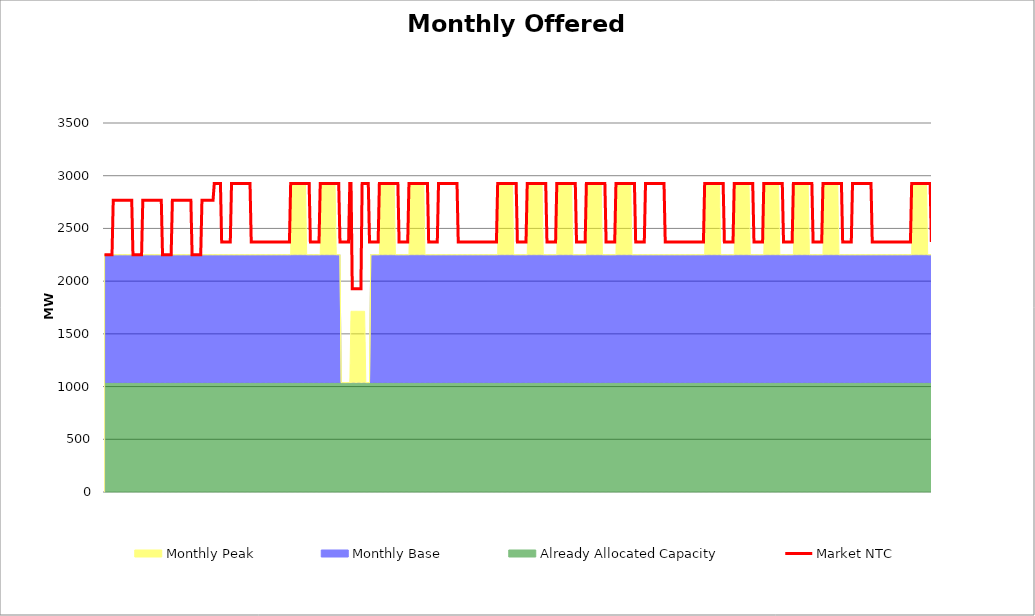
| Category | Market NTC |
|---|---|
| 0 | 2251 |
| 1 | 2251 |
| 2 | 2251 |
| 3 | 2251 |
| 4 | 2251 |
| 5 | 2251 |
| 6 | 2251 |
| 7 | 2767 |
| 8 | 2767 |
| 9 | 2767 |
| 10 | 2767 |
| 11 | 2767 |
| 12 | 2767 |
| 13 | 2767 |
| 14 | 2767 |
| 15 | 2767 |
| 16 | 2767 |
| 17 | 2767 |
| 18 | 2767 |
| 19 | 2767 |
| 20 | 2767 |
| 21 | 2767 |
| 22 | 2767 |
| 23 | 2251 |
| 24 | 2251 |
| 25 | 2251 |
| 26 | 2251 |
| 27 | 2251 |
| 28 | 2251 |
| 29 | 2251 |
| 30 | 2251 |
| 31 | 2767 |
| 32 | 2767 |
| 33 | 2767 |
| 34 | 2767 |
| 35 | 2767 |
| 36 | 2767 |
| 37 | 2767 |
| 38 | 2767 |
| 39 | 2767 |
| 40 | 2767 |
| 41 | 2767 |
| 42 | 2767 |
| 43 | 2767 |
| 44 | 2767 |
| 45 | 2767 |
| 46 | 2767 |
| 47 | 2251 |
| 48 | 2251 |
| 49 | 2251 |
| 50 | 2251 |
| 51 | 2251 |
| 52 | 2251 |
| 53 | 2251 |
| 54 | 2251 |
| 55 | 2767 |
| 56 | 2767 |
| 57 | 2767 |
| 58 | 2767 |
| 59 | 2767 |
| 60 | 2767 |
| 61 | 2767 |
| 62 | 2767 |
| 63 | 2767 |
| 64 | 2767 |
| 65 | 2767 |
| 66 | 2767 |
| 67 | 2767 |
| 68 | 2767 |
| 69 | 2767 |
| 70 | 2767 |
| 71 | 2251 |
| 72 | 2251 |
| 73 | 2251 |
| 74 | 2251 |
| 75 | 2251 |
| 76 | 2251 |
| 77 | 2251 |
| 78 | 2251 |
| 79 | 2767 |
| 80 | 2767 |
| 81 | 2767 |
| 82 | 2767 |
| 83 | 2767 |
| 84 | 2767 |
| 85 | 2767 |
| 86 | 2767 |
| 87 | 2767 |
| 88 | 2767 |
| 89 | 2927 |
| 90 | 2927 |
| 91 | 2927 |
| 92 | 2927 |
| 93 | 2927 |
| 94 | 2927 |
| 95 | 2371 |
| 96 | 2371 |
| 97 | 2371 |
| 98 | 2371 |
| 99 | 2371 |
| 100 | 2371 |
| 101 | 2371 |
| 102 | 2371 |
| 103 | 2927 |
| 104 | 2927 |
| 105 | 2927 |
| 106 | 2927 |
| 107 | 2927 |
| 108 | 2927 |
| 109 | 2927 |
| 110 | 2927 |
| 111 | 2927 |
| 112 | 2927 |
| 113 | 2927 |
| 114 | 2927 |
| 115 | 2927 |
| 116 | 2927 |
| 117 | 2927 |
| 118 | 2927 |
| 119 | 2371 |
| 120 | 2371 |
| 121 | 2371 |
| 122 | 2371 |
| 123 | 2371 |
| 124 | 2371 |
| 125 | 2371 |
| 126 | 2371 |
| 127 | 2371 |
| 128 | 2371 |
| 129 | 2371 |
| 130 | 2371 |
| 131 | 2371 |
| 132 | 2371 |
| 133 | 2371 |
| 134 | 2371 |
| 135 | 2371 |
| 136 | 2371 |
| 137 | 2371 |
| 138 | 2371 |
| 139 | 2371 |
| 140 | 2371 |
| 141 | 2371 |
| 142 | 2371 |
| 143 | 2371 |
| 144 | 2371 |
| 145 | 2371 |
| 146 | 2371 |
| 147 | 2371 |
| 148 | 2371 |
| 149 | 2371 |
| 150 | 2371 |
| 151 | 2927 |
| 152 | 2927 |
| 153 | 2927 |
| 154 | 2927 |
| 155 | 2927 |
| 156 | 2927 |
| 157 | 2927 |
| 158 | 2927 |
| 159 | 2927 |
| 160 | 2927 |
| 161 | 2927 |
| 162 | 2927 |
| 163 | 2927 |
| 164 | 2927 |
| 165 | 2927 |
| 166 | 2927 |
| 167 | 2371 |
| 168 | 2371 |
| 169 | 2371 |
| 170 | 2371 |
| 171 | 2371 |
| 172 | 2371 |
| 173 | 2371 |
| 174 | 2371 |
| 175 | 2927 |
| 176 | 2927 |
| 177 | 2927 |
| 178 | 2927 |
| 179 | 2927 |
| 180 | 2927 |
| 181 | 2927 |
| 182 | 2927 |
| 183 | 2927 |
| 184 | 2927 |
| 185 | 2927 |
| 186 | 2927 |
| 187 | 2927 |
| 188 | 2927 |
| 189 | 2927 |
| 190 | 2927 |
| 191 | 2371 |
| 192 | 2371 |
| 193 | 2371 |
| 194 | 2371 |
| 195 | 2371 |
| 196 | 2371 |
| 197 | 2371 |
| 198 | 2371 |
| 199 | 2927 |
| 200 | 2927 |
| 201 | 1927 |
| 202 | 1927 |
| 203 | 1927 |
| 204 | 1927 |
| 205 | 1927 |
| 206 | 1927 |
| 207 | 1927 |
| 208 | 1927 |
| 209 | 2927 |
| 210 | 2927 |
| 211 | 2927 |
| 212 | 2927 |
| 213 | 2927 |
| 214 | 2927 |
| 215 | 2371 |
| 216 | 2371 |
| 217 | 2371 |
| 218 | 2371 |
| 219 | 2371 |
| 220 | 2371 |
| 221 | 2371 |
| 222 | 2371 |
| 223 | 2927 |
| 224 | 2927 |
| 225 | 2927 |
| 226 | 2927 |
| 227 | 2927 |
| 228 | 2927 |
| 229 | 2927 |
| 230 | 2927 |
| 231 | 2927 |
| 232 | 2927 |
| 233 | 2927 |
| 234 | 2927 |
| 235 | 2927 |
| 236 | 2927 |
| 237 | 2927 |
| 238 | 2927 |
| 239 | 2371 |
| 240 | 2371 |
| 241 | 2371 |
| 242 | 2371 |
| 243 | 2371 |
| 244 | 2371 |
| 245 | 2371 |
| 246 | 2371 |
| 247 | 2927 |
| 248 | 2927 |
| 249 | 2927 |
| 250 | 2927 |
| 251 | 2927 |
| 252 | 2927 |
| 253 | 2927 |
| 254 | 2927 |
| 255 | 2927 |
| 256 | 2927 |
| 257 | 2927 |
| 258 | 2927 |
| 259 | 2927 |
| 260 | 2927 |
| 261 | 2927 |
| 262 | 2927 |
| 263 | 2371 |
| 264 | 2371 |
| 265 | 2371 |
| 266 | 2371 |
| 267 | 2371 |
| 268 | 2371 |
| 269 | 2371 |
| 270 | 2371 |
| 271 | 2927 |
| 272 | 2927 |
| 273 | 2927 |
| 274 | 2927 |
| 275 | 2927 |
| 276 | 2927 |
| 277 | 2927 |
| 278 | 2927 |
| 279 | 2927 |
| 280 | 2927 |
| 281 | 2927 |
| 282 | 2927 |
| 283 | 2927 |
| 284 | 2927 |
| 285 | 2927 |
| 286 | 2927 |
| 287 | 2371 |
| 288 | 2371 |
| 289 | 2371 |
| 290 | 2371 |
| 291 | 2371 |
| 292 | 2371 |
| 293 | 2371 |
| 294 | 2371 |
| 295 | 2371 |
| 296 | 2371 |
| 297 | 2371 |
| 298 | 2371 |
| 299 | 2371 |
| 300 | 2371 |
| 301 | 2371 |
| 302 | 2371 |
| 303 | 2371 |
| 304 | 2371 |
| 305 | 2371 |
| 306 | 2371 |
| 307 | 2371 |
| 308 | 2371 |
| 309 | 2371 |
| 310 | 2371 |
| 311 | 2371 |
| 312 | 2371 |
| 313 | 2371 |
| 314 | 2371 |
| 315 | 2371 |
| 316 | 2371 |
| 317 | 2371 |
| 318 | 2371 |
| 319 | 2927 |
| 320 | 2927 |
| 321 | 2927 |
| 322 | 2927 |
| 323 | 2927 |
| 324 | 2927 |
| 325 | 2927 |
| 326 | 2927 |
| 327 | 2927 |
| 328 | 2927 |
| 329 | 2927 |
| 330 | 2927 |
| 331 | 2927 |
| 332 | 2927 |
| 333 | 2927 |
| 334 | 2927 |
| 335 | 2371 |
| 336 | 2371 |
| 337 | 2371 |
| 338 | 2371 |
| 339 | 2371 |
| 340 | 2371 |
| 341 | 2371 |
| 342 | 2371 |
| 343 | 2927 |
| 344 | 2927 |
| 345 | 2927 |
| 346 | 2927 |
| 347 | 2927 |
| 348 | 2927 |
| 349 | 2927 |
| 350 | 2927 |
| 351 | 2927 |
| 352 | 2927 |
| 353 | 2927 |
| 354 | 2927 |
| 355 | 2927 |
| 356 | 2927 |
| 357 | 2927 |
| 358 | 2927 |
| 359 | 2371 |
| 360 | 2371 |
| 361 | 2371 |
| 362 | 2371 |
| 363 | 2371 |
| 364 | 2371 |
| 365 | 2371 |
| 366 | 2371 |
| 367 | 2927 |
| 368 | 2927 |
| 369 | 2927 |
| 370 | 2927 |
| 371 | 2927 |
| 372 | 2927 |
| 373 | 2927 |
| 374 | 2927 |
| 375 | 2927 |
| 376 | 2927 |
| 377 | 2927 |
| 378 | 2927 |
| 379 | 2927 |
| 380 | 2927 |
| 381 | 2927 |
| 382 | 2927 |
| 383 | 2371 |
| 384 | 2371 |
| 385 | 2371 |
| 386 | 2371 |
| 387 | 2371 |
| 388 | 2371 |
| 389 | 2371 |
| 390 | 2371 |
| 391 | 2927 |
| 392 | 2927 |
| 393 | 2927 |
| 394 | 2927 |
| 395 | 2927 |
| 396 | 2927 |
| 397 | 2927 |
| 398 | 2927 |
| 399 | 2927 |
| 400 | 2927 |
| 401 | 2927 |
| 402 | 2927 |
| 403 | 2927 |
| 404 | 2927 |
| 405 | 2927 |
| 406 | 2927 |
| 407 | 2371 |
| 408 | 2371 |
| 409 | 2371 |
| 410 | 2371 |
| 411 | 2371 |
| 412 | 2371 |
| 413 | 2371 |
| 414 | 2371 |
| 415 | 2927 |
| 416 | 2927 |
| 417 | 2927 |
| 418 | 2927 |
| 419 | 2927 |
| 420 | 2927 |
| 421 | 2927 |
| 422 | 2927 |
| 423 | 2927 |
| 424 | 2927 |
| 425 | 2927 |
| 426 | 2927 |
| 427 | 2927 |
| 428 | 2927 |
| 429 | 2927 |
| 430 | 2927 |
| 431 | 2371 |
| 432 | 2371 |
| 433 | 2371 |
| 434 | 2371 |
| 435 | 2371 |
| 436 | 2371 |
| 437 | 2371 |
| 438 | 2371 |
| 439 | 2927 |
| 440 | 2927 |
| 441 | 2927 |
| 442 | 2927 |
| 443 | 2927 |
| 444 | 2927 |
| 445 | 2927 |
| 446 | 2927 |
| 447 | 2927 |
| 448 | 2927 |
| 449 | 2927 |
| 450 | 2927 |
| 451 | 2927 |
| 452 | 2927 |
| 453 | 2927 |
| 454 | 2927 |
| 455 | 2371 |
| 456 | 2371 |
| 457 | 2371 |
| 458 | 2371 |
| 459 | 2371 |
| 460 | 2371 |
| 461 | 2371 |
| 462 | 2371 |
| 463 | 2371 |
| 464 | 2371 |
| 465 | 2371 |
| 466 | 2371 |
| 467 | 2371 |
| 468 | 2371 |
| 469 | 2371 |
| 470 | 2371 |
| 471 | 2371 |
| 472 | 2371 |
| 473 | 2371 |
| 474 | 2371 |
| 475 | 2371 |
| 476 | 2371 |
| 477 | 2371 |
| 478 | 2371 |
| 479 | 2371 |
| 480 | 2371 |
| 481 | 2371 |
| 482 | 2371 |
| 483 | 2371 |
| 484 | 2371 |
| 485 | 2371 |
| 486 | 2371 |
| 487 | 2927 |
| 488 | 2927 |
| 489 | 2927 |
| 490 | 2927 |
| 491 | 2927 |
| 492 | 2927 |
| 493 | 2927 |
| 494 | 2927 |
| 495 | 2927 |
| 496 | 2927 |
| 497 | 2927 |
| 498 | 2927 |
| 499 | 2927 |
| 500 | 2927 |
| 501 | 2927 |
| 502 | 2927 |
| 503 | 2371 |
| 504 | 2371 |
| 505 | 2371 |
| 506 | 2371 |
| 507 | 2371 |
| 508 | 2371 |
| 509 | 2371 |
| 510 | 2371 |
| 511 | 2927 |
| 512 | 2927 |
| 513 | 2927 |
| 514 | 2927 |
| 515 | 2927 |
| 516 | 2927 |
| 517 | 2927 |
| 518 | 2927 |
| 519 | 2927 |
| 520 | 2927 |
| 521 | 2927 |
| 522 | 2927 |
| 523 | 2927 |
| 524 | 2927 |
| 525 | 2927 |
| 526 | 2927 |
| 527 | 2371 |
| 528 | 2371 |
| 529 | 2371 |
| 530 | 2371 |
| 531 | 2371 |
| 532 | 2371 |
| 533 | 2371 |
| 534 | 2371 |
| 535 | 2927 |
| 536 | 2927 |
| 537 | 2927 |
| 538 | 2927 |
| 539 | 2927 |
| 540 | 2927 |
| 541 | 2927 |
| 542 | 2927 |
| 543 | 2927 |
| 544 | 2927 |
| 545 | 2927 |
| 546 | 2927 |
| 547 | 2927 |
| 548 | 2927 |
| 549 | 2927 |
| 550 | 2927 |
| 551 | 2371 |
| 552 | 2371 |
| 553 | 2371 |
| 554 | 2371 |
| 555 | 2371 |
| 556 | 2371 |
| 557 | 2371 |
| 558 | 2371 |
| 559 | 2927 |
| 560 | 2927 |
| 561 | 2927 |
| 562 | 2927 |
| 563 | 2927 |
| 564 | 2927 |
| 565 | 2927 |
| 566 | 2927 |
| 567 | 2927 |
| 568 | 2927 |
| 569 | 2927 |
| 570 | 2927 |
| 571 | 2927 |
| 572 | 2927 |
| 573 | 2927 |
| 574 | 2927 |
| 575 | 2371 |
| 576 | 2371 |
| 577 | 2371 |
| 578 | 2371 |
| 579 | 2371 |
| 580 | 2371 |
| 581 | 2371 |
| 582 | 2371 |
| 583 | 2927 |
| 584 | 2927 |
| 585 | 2927 |
| 586 | 2927 |
| 587 | 2927 |
| 588 | 2927 |
| 589 | 2927 |
| 590 | 2927 |
| 591 | 2927 |
| 592 | 2927 |
| 593 | 2927 |
| 594 | 2927 |
| 595 | 2927 |
| 596 | 2927 |
| 597 | 2927 |
| 598 | 2927 |
| 599 | 2371 |
| 600 | 2371 |
| 601 | 2371 |
| 602 | 2371 |
| 603 | 2371 |
| 604 | 2371 |
| 605 | 2371 |
| 606 | 2371 |
| 607 | 2927 |
| 608 | 2927 |
| 609 | 2927 |
| 610 | 2927 |
| 611 | 2927 |
| 612 | 2927 |
| 613 | 2927 |
| 614 | 2927 |
| 615 | 2927 |
| 616 | 2927 |
| 617 | 2927 |
| 618 | 2927 |
| 619 | 2927 |
| 620 | 2927 |
| 621 | 2927 |
| 622 | 2927 |
| 623 | 2371 |
| 624 | 2371 |
| 625 | 2371 |
| 626 | 2371 |
| 627 | 2371 |
| 628 | 2371 |
| 629 | 2371 |
| 630 | 2371 |
| 631 | 2371 |
| 632 | 2371 |
| 633 | 2371 |
| 634 | 2371 |
| 635 | 2371 |
| 636 | 2371 |
| 637 | 2371 |
| 638 | 2371 |
| 639 | 2371 |
| 640 | 2371 |
| 641 | 2371 |
| 642 | 2371 |
| 643 | 2371 |
| 644 | 2371 |
| 645 | 2371 |
| 646 | 2371 |
| 647 | 2371 |
| 648 | 2371 |
| 649 | 2371 |
| 650 | 2371 |
| 651 | 2371 |
| 652 | 2371 |
| 653 | 2371 |
| 654 | 2371 |
| 655 | 2927 |
| 656 | 2927 |
| 657 | 2927 |
| 658 | 2927 |
| 659 | 2927 |
| 660 | 2927 |
| 661 | 2927 |
| 662 | 2927 |
| 663 | 2927 |
| 664 | 2927 |
| 665 | 2927 |
| 666 | 2927 |
| 667 | 2927 |
| 668 | 2927 |
| 669 | 2927 |
| 670 | 2927 |
| 671 | 2371 |